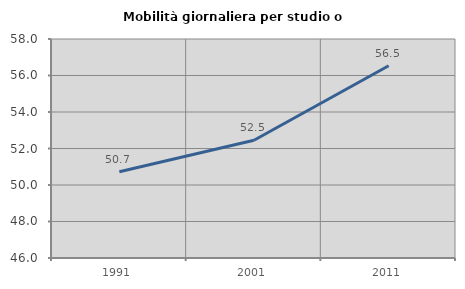
| Category | Mobilità giornaliera per studio o lavoro |
|---|---|
| 1991.0 | 50.729 |
| 2001.0 | 52.452 |
| 2011.0 | 56.536 |